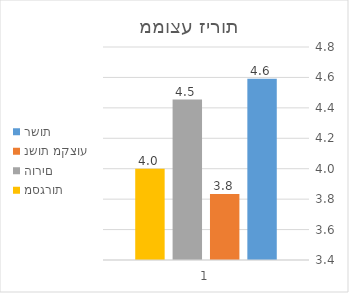
| Category | רשות | נשות מקצוע | הורים | מסגרות |
|---|---|---|---|---|
| 0 | 4.591 | 3.833 | 4.455 | 4 |